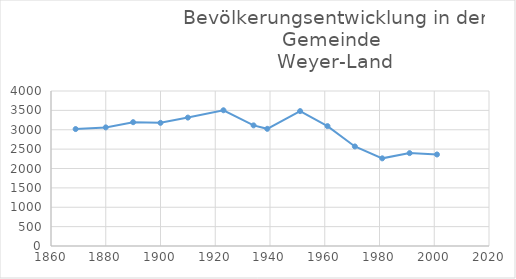
| Category | Einwohnerzahl |
|---|---|
| 1869.0 | 3018 |
| 1880.0 | 3061 |
| 1890.0 | 3195 |
| 1900.0 | 3178 |
| 1910.0 | 3314 |
| 1923.0 | 3503 |
| 1934.0 | 3113 |
| 1939.0 | 3024 |
| 1951.0 | 3481 |
| 1961.0 | 3094 |
| 1971.0 | 2569 |
| 1981.0 | 2262 |
| 1991.0 | 2397 |
| 2001.0 | 2362 |